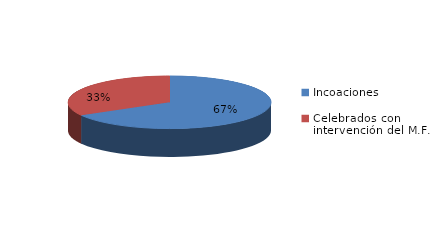
| Category | Series 0 |
|---|---|
| Incoaciones | 1565 |
| Celebrados con intervención del M.F. | 781 |